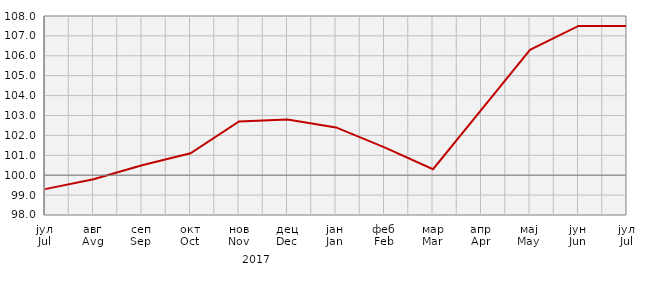
| Category | Индекси цијена произвођача
Producer price indices |
|---|---|
| јул
Jul | 99.3 |
| авг
Avg | 99.8 |
| сеп
Sep | 100.5 |
| окт
Oct | 101.1 |
| нов
Nov | 102.7 |
| дец
Dec | 102.8 |
| јан
Jan | 102.4 |
| феб
Feb | 101.4 |
| мар
Mar | 100.3 |
| апр
Apr | 103.3 |
| мај
May | 106.3 |
| јун
Jun | 107.5 |
| јул
Jul | 107.5 |